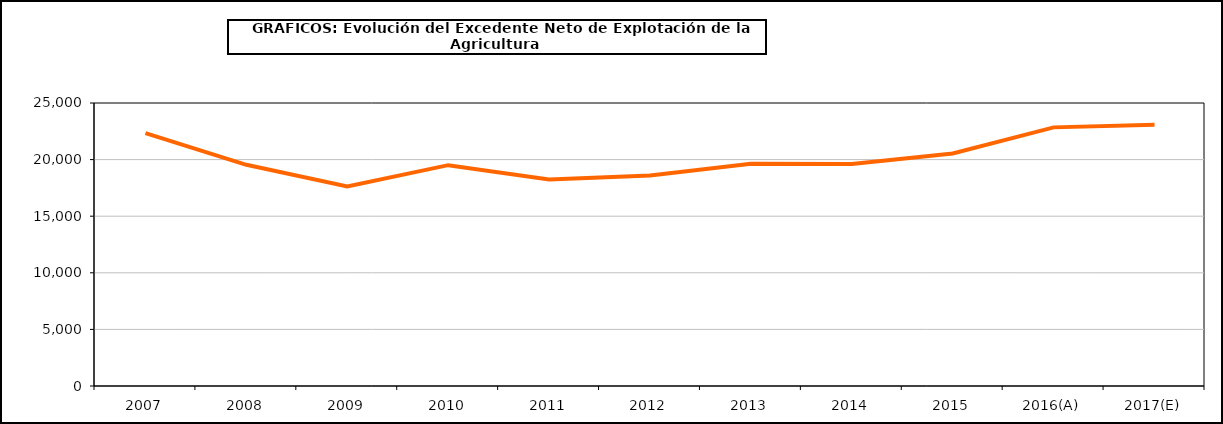
| Category | excedente neto de explotacion |
|---|---|
| 2007 | 22333.308 |
| 2008 | 19538.087 |
| 2009 | 17624.014 |
| 2010 | 19508.768 |
| 2011 | 18252.686 |
| 2012 | 18589.082 |
| 2013 | 19635.617 |
| 2014 | 19616.041 |
| 2015 | 20539.815 |
| 2016(A) | 22846.97 |
| 2017(E) | 23069.296 |